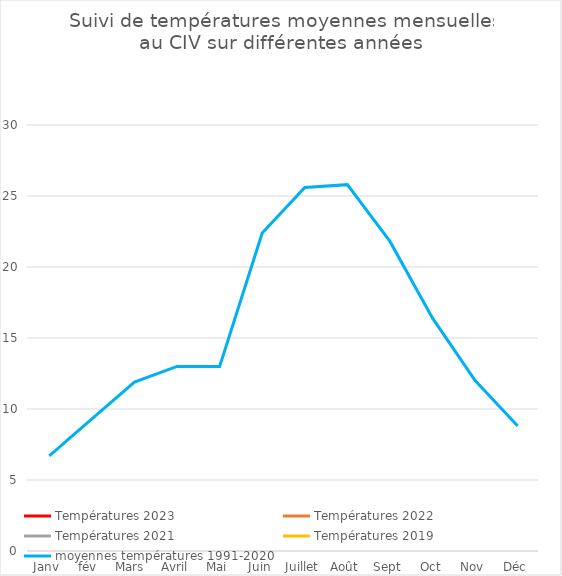
| Category | Températures 2023 | Températures 2022 | Températures 2021 | Températures 2019 | moyennes températures 1991-2020 |
|---|---|---|---|---|---|
| Janv |  |  |  |  | 6.7 |
| fév  |  |  |  |  | 9.3 |
| Mars  |  |  |  |  | 11.9 |
| Avril |  |  |  |  | 13 |
| Mai |  |  |  |  | 13 |
| Juin |  |  |  |  | 22.4 |
| Juillet |  |  |  |  | 25.6 |
| Août |  |  |  |  | 25.8 |
| Sept |  |  |  |  | 21.8 |
| Oct |  |  |  |  | 16.4 |
| Nov |  |  |  |  | 12 |
| Déc |  |  |  |  | 8.8 |